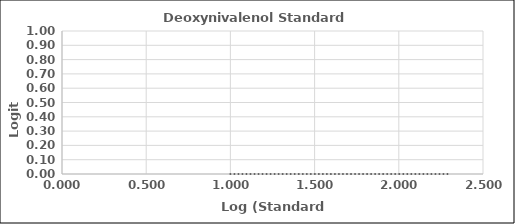
| Category | Series 0 |
|---|---|
| 1.0 | 0 |
| 1.3979400086720377 | 0 |
| 1.6989700043360187 | 0 |
| 2.0 | 0 |
| 2.3010299956639813 | 0 |